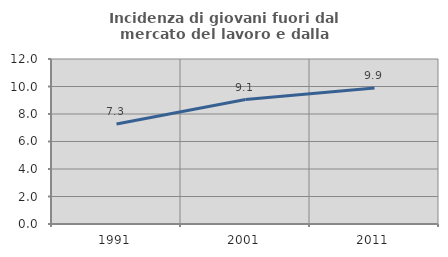
| Category | Incidenza di giovani fuori dal mercato del lavoro e dalla formazione  |
|---|---|
| 1991.0 | 7.267 |
| 2001.0 | 9.05 |
| 2011.0 | 9.892 |